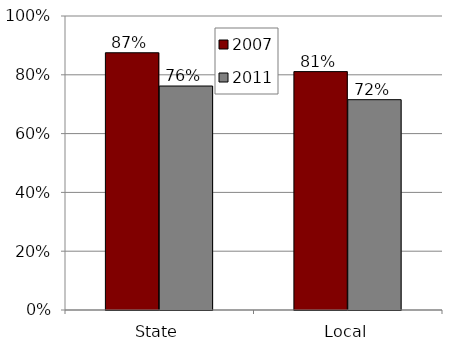
| Category | 2007 | 2011 |
|---|---|---|
| State | 0.875 | 0.762 |
| Local | 0.811 | 0.715 |